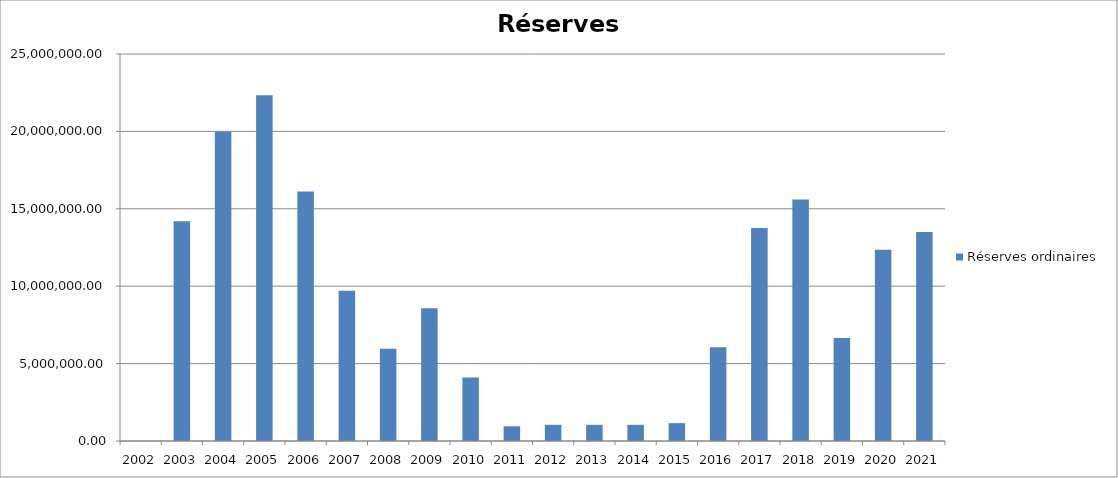
| Category | Réserves ordinaires |
|---|---|
| 2002.0 | 0 |
| 2003.0 | 14187810.39 |
| 2004.0 | 19979200.79 |
| 2005.0 | 22331713.56 |
| 2006.0 | 16114911.72 |
| 2007.0 | 9710654.1 |
| 2008.0 | 5958218.33 |
| 2009.0 | 8576217.07 |
| 2010.0 | 4095608.52 |
| 2011.0 | 949643.07 |
| 2012.0 | 1045495.59 |
| 2013.0 | 1045495.59 |
| 2014.0 | 1045495.59 |
| 2015.0 | 1152429.93 |
| 2016.0 | 6057112.41 |
| 2017.0 | 13752081.37 |
| 2018.0 | 15605765.53 |
| 2019.0 | 6651710.26 |
| 2020.0 | 12352418.4 |
| 2021.0 | 13504695.48 |